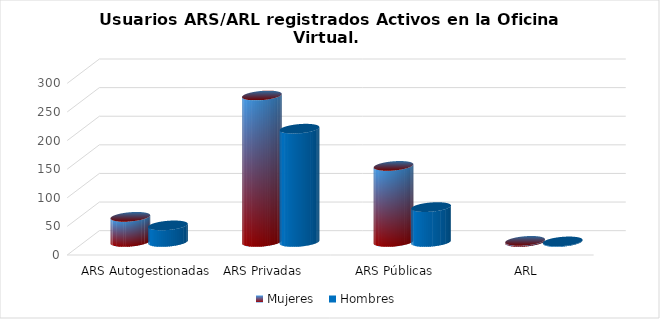
| Category | Mujeres | Hombres |
|---|---|---|
| ARS Autogestionadas | 44 | 29 |
| ARS Privadas | 256 | 198 |
| ARS Públicas | 133 | 61 |
| ARL | 2 | 1 |